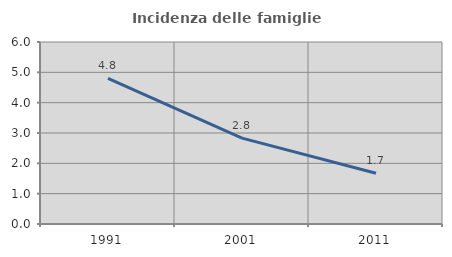
| Category | Incidenza delle famiglie numerose |
|---|---|
| 1991.0 | 4.802 |
| 2001.0 | 2.83 |
| 2011.0 | 1.673 |